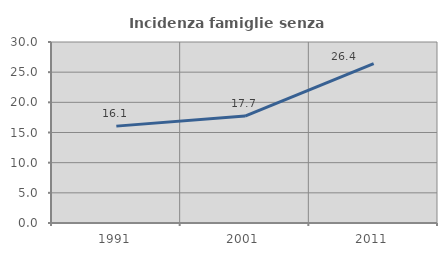
| Category | Incidenza famiglie senza nuclei |
|---|---|
| 1991.0 | 16.057 |
| 2001.0 | 17.717 |
| 2011.0 | 26.418 |